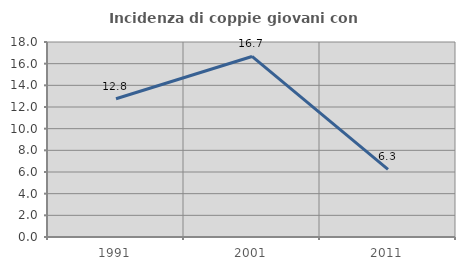
| Category | Incidenza di coppie giovani con figli |
|---|---|
| 1991.0 | 12.766 |
| 2001.0 | 16.667 |
| 2011.0 | 6.25 |